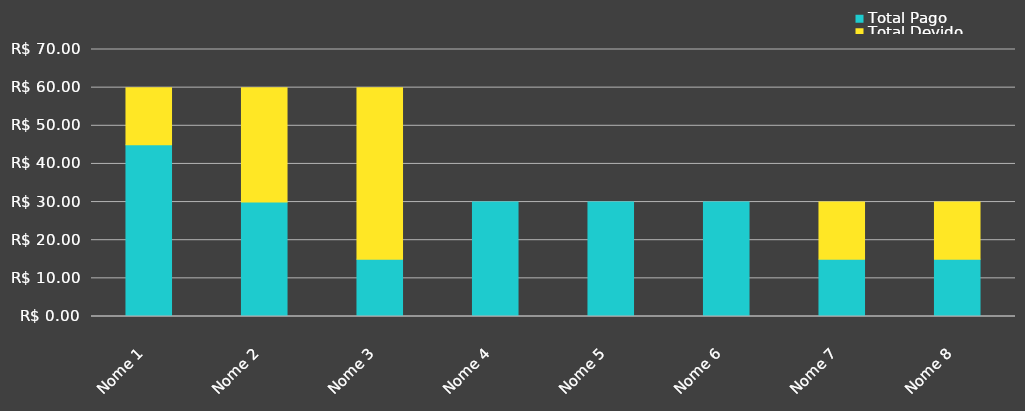
| Category | Total Pago | Total Devido |
|---|---|---|
| Nome 1 | 45 | 15 |
| Nome 2 | 30 | 30 |
| Nome 3 | 15 | 45 |
| Nome 4 | 30 | 0 |
| Nome 5 | 30 | 0 |
| Nome 6 | 30 | 0 |
| Nome 7 | 15 | 15 |
| Nome 8 | 15 | 15 |